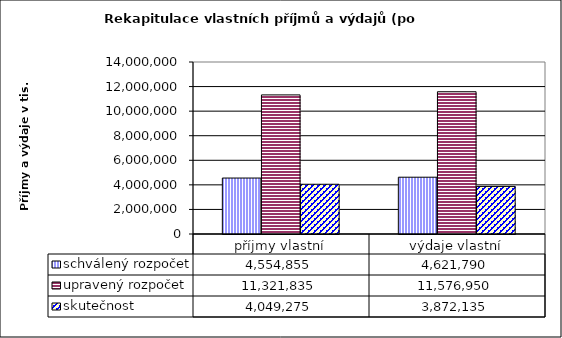
| Category | schválený rozpočet | upravený rozpočet | skutečnost |
|---|---|---|---|
| příjmy vlastní | 4554855 | 11321835 | 4049275 |
| výdaje vlastní | 4621790 | 11576950 | 3872135 |